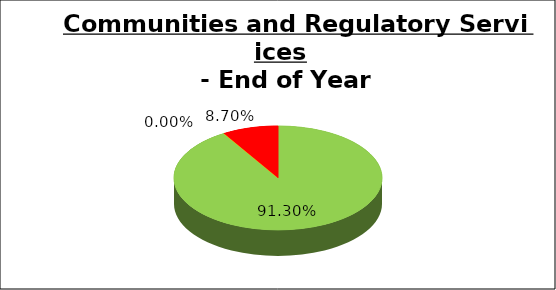
| Category | Q4 |
|---|---|
| Green | 0.913 |
| Amber | 0 |
| Red | 0.087 |